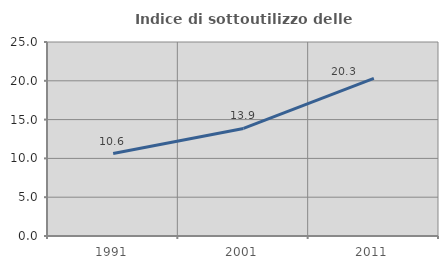
| Category | Indice di sottoutilizzo delle abitazioni  |
|---|---|
| 1991.0 | 10.63 |
| 2001.0 | 13.861 |
| 2011.0 | 20.314 |